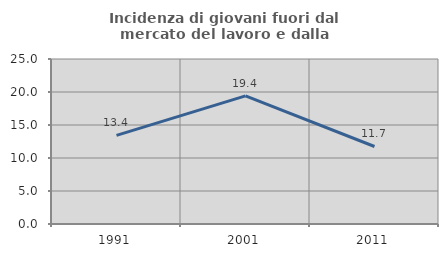
| Category | Incidenza di giovani fuori dal mercato del lavoro e dalla formazione  |
|---|---|
| 1991.0 | 13.436 |
| 2001.0 | 19.415 |
| 2011.0 | 11.744 |